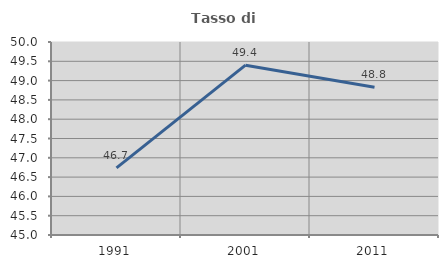
| Category | Tasso di occupazione   |
|---|---|
| 1991.0 | 46.737 |
| 2001.0 | 49.4 |
| 2011.0 | 48.829 |